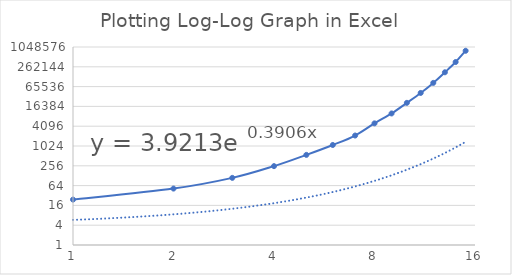
| Category | Plotting Log-Log Graph in Excel |
|---|---|
| 1.0 | 24 |
| 2.0 | 52 |
| 3.0 | 110 |
| 4.0 | 250 |
| 5.0 | 550 |
| 6.0 | 1100 |
| 7.0 | 2132 |
| 8.0 | 5000 |
| 9.0 | 10000 |
| 10.0 | 21000 |
| 11.0 | 42000 |
| 12.0 | 85000 |
| 13.0 | 178500 |
| 14.0 | 365925 |
| 15.0 | 805035 |